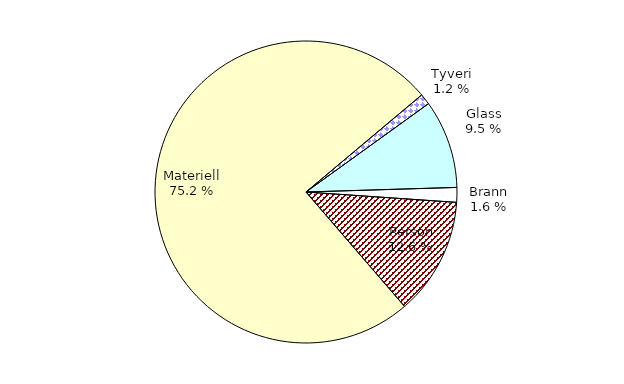
| Category | Series 0 |
|---|---|
| Tyveri | 42.865 |
| Glass | 347.183 |
| Brann | 57.965 |
| Person | 462.066 |
| Materiell | 2760.174 |